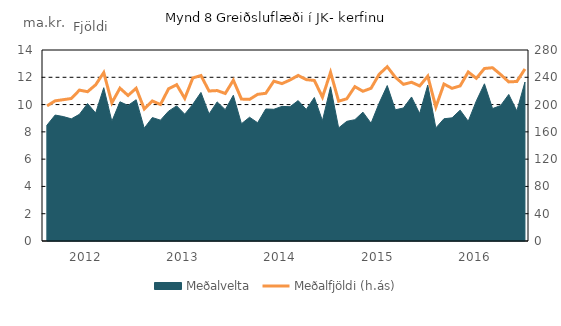
| Category | Meðalfjöldi (h.ás) |
|---|---|
| nan | 198.097 |
| nan | 205.498 |
| nan | 207.17 |
| nan | 208.901 |
| nan | 221.191 |
| 2012.0 | 218.826 |
| nan | 228.968 |
| nan | 246.956 |
| nan | 202.488 |
| nan | 224.052 |
| nan | 213.34 |
| nan | 223.929 |
| nan | 193.641 |
| nan | 205.276 |
| nan | 200.073 |
| nan | 223.089 |
| nan | 229.174 |
| 2013.0 | 209.027 |
| nan | 239.031 |
| nan | 242.534 |
| nan | 219.888 |
| nan | 220.53 |
| nan | 216.259 |
| nan | 235.71 |
| nan | 208.05 |
| nan | 207.615 |
| nan | 214.988 |
| nan | 216.529 |
| nan | 234.285 |
| 2014.0 | 230.728 |
| nan | 236.043 |
| nan | 242.724 |
| nan | 236.585 |
| nan | 235.351 |
| nan | 210.776 |
| nan | 247.272 |
| nan | 204.941 |
| nan | 208.482 |
| nan | 226.266 |
| nan | 219.495 |
| nan | 223.922 |
| 2015.0 | 244.416 |
| nan | 255.482 |
| nan | 240.037 |
| nan | 229.65 |
| nan | 232.729 |
| nan | 227.295 |
| nan | 241.651 |
| nan | 196.414 |
| nan | 230.108 |
| nan | 223.829 |
| nan | 227.397 |
| nan | 247.772 |
| 2016.0 | 238.508 |
| nan | 252.9 |
| nan | 254.013 |
| nan | 244.05 |
| nan | 233.224 |
| nan | 233.855 |
| nan | 252.186 |